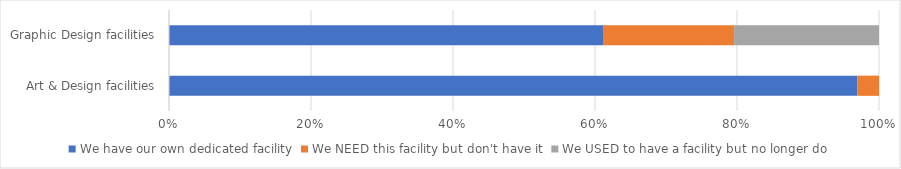
| Category | We have our own dedicated facility | We NEED this facility but don't have it | We USED to have a facility but no longer do |
|---|---|---|---|
| Art & Design facilities | 0.97 | 0.03 | 0 |
| Graphic Design facilities | 0.612 | 0.184 | 0.204 |